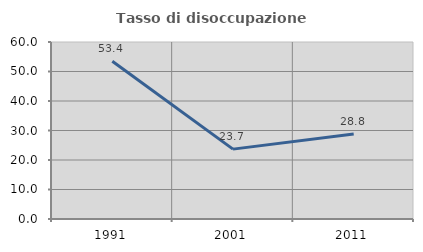
| Category | Tasso di disoccupazione giovanile  |
|---|---|
| 1991.0 | 53.448 |
| 2001.0 | 23.684 |
| 2011.0 | 28.814 |